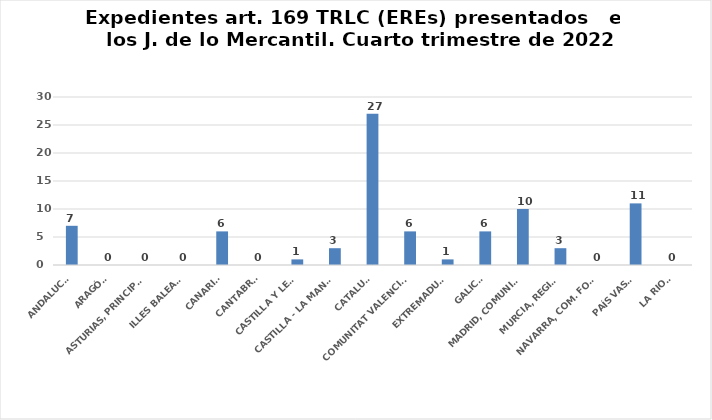
| Category | Series 0 |
|---|---|
| ANDALUCÍA | 7 |
| ARAGÓN | 0 |
| ASTURIAS, PRINCIPADO | 0 |
| ILLES BALEARS | 0 |
| CANARIAS | 6 |
| CANTABRIA | 0 |
| CASTILLA Y LEÓN | 1 |
| CASTILLA - LA MANCHA | 3 |
| CATALUÑA | 27 |
| COMUNITAT VALENCIANA | 6 |
| EXTREMADURA | 1 |
| GALICIA | 6 |
| MADRID, COMUNIDAD | 10 |
| MURCIA, REGIÓN | 3 |
| NAVARRA, COM. FORAL | 0 |
| PAÍS VASCO | 11 |
| LA RIOJA | 0 |